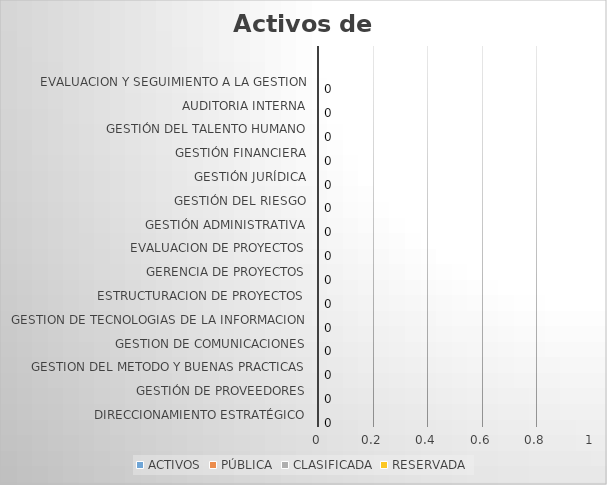
| Category | ACTIVOS | PÚBLICA | CLASIFICADA | RESERVADA |
|---|---|---|---|---|
| DIRECCIONAMIENTO ESTRATÉGICO | 0 | 0 | 0 | 0 |
| GESTIÓN DE PROVEEDORES | 0 | 0 | 0 | 0 |
| GESTION DEL METODO Y BUENAS PRACTICAS | 0 | 0 | 0 | 0 |
| GESTION DE COMUNICACIONES | 0 | 0 | 0 | 0 |
| GESTION DE TECNOLOGIAS DE LA INFORMACION | 0 | 0 | 0 | 0 |
| ESTRUCTURACION DE PROYECTOS | 0 | 0 | 0 | 0 |
| GERENCIA DE PROYECTOS | 0 | 0 | 0 | 0 |
| EVALUACION DE PROYECTOS | 0 | 0 | 0 | 0 |
| GESTIÓN ADMINISTRATIVA | 0 | 0 | 0 | 0 |
| GESTIÓN DEL RIESGO | 0 | 0 | 0 | 0 |
| GESTIÓN JURÍDICA | 0 | 0 | 0 | 0 |
| GESTIÓN FINANCIERA | 0 | 0 | 0 | 0 |
| GESTIÓN DEL TALENTO HUMANO | 0 | 0 | 0 | 0 |
| AUDITORIA INTERNA | 0 | 0 | 0 | 0 |
| EVALUACION Y SEGUIMIENTO A LA GESTION | 0 | 0 | 0 | 0 |